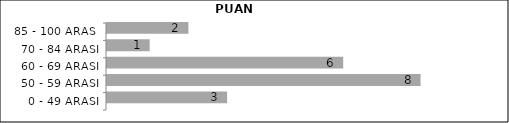
| Category | Series 0 | Series 1 | Series 2 |
|---|---|---|---|
| 0 - 49 ARASI |  |  | 3 |
| 50 - 59 ARASI |  |  | 8 |
| 60 - 69 ARASI |  |  | 6 |
| 70 - 84 ARASI |  |  | 1 |
| 85 - 100 ARASI |  |  | 2 |